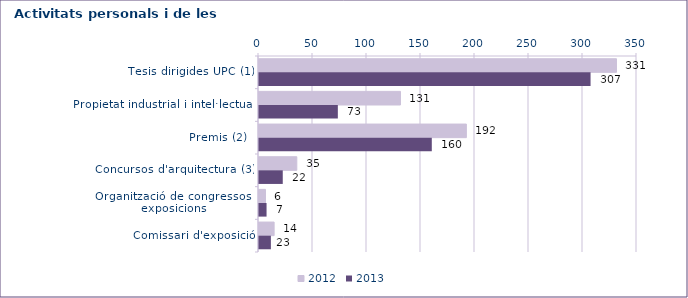
| Category | 2012 | 2013 |
|---|---|---|
| Tesis dirigides UPC (1) | 331 | 307 |
| Propietat industrial i intel·lectual | 131 | 73 |
| Premis (2)  | 192 | 160 |
| Concursos d'arquitectura (3) | 35 | 22 |
| Organització de congressos i exposicions | 6 | 7 |
| Comissari d'exposició | 14 | 11 |